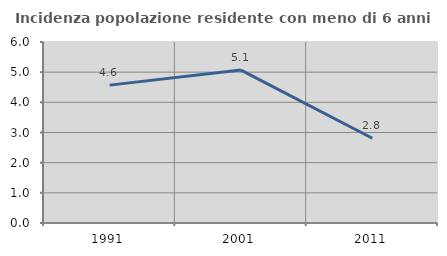
| Category | Incidenza popolazione residente con meno di 6 anni |
|---|---|
| 1991.0 | 4.57 |
| 2001.0 | 5.068 |
| 2011.0 | 2.809 |